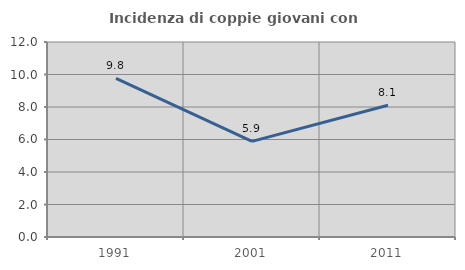
| Category | Incidenza di coppie giovani con figli |
|---|---|
| 1991.0 | 9.756 |
| 2001.0 | 5.882 |
| 2011.0 | 8.108 |